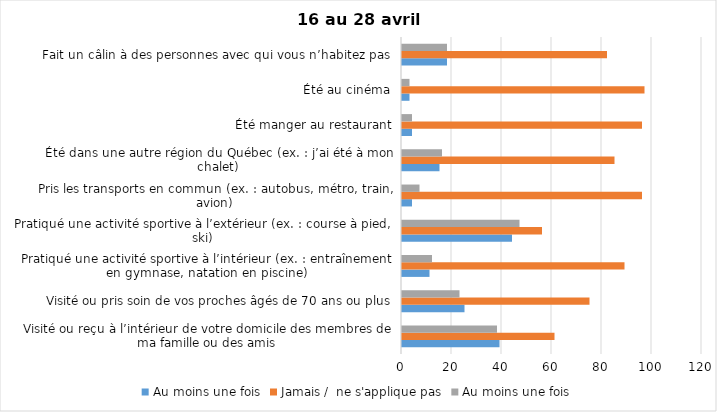
| Category | Au moins une fois | Jamais /  ne s'applique pas |
|---|---|---|
| Visité ou reçu à l’intérieur de votre domicile des membres de ma famille ou des amis | 38 | 61 |
| Visité ou pris soin de vos proches âgés de 70 ans ou plus | 23 | 75 |
| Pratiqué une activité sportive à l’intérieur (ex. : entraînement en gymnase, natation en piscine) | 12 | 89 |
| Pratiqué une activité sportive à l’extérieur (ex. : course à pied, ski) | 47 | 56 |
| Pris les transports en commun (ex. : autobus, métro, train, avion) | 7 | 96 |
| Été dans une autre région du Québec (ex. : j’ai été à mon chalet) | 16 | 85 |
| Été manger au restaurant | 4 | 96 |
| Été au cinéma | 3 | 97 |
| Fait un câlin à des personnes avec qui vous n’habitez pas | 18 | 82 |